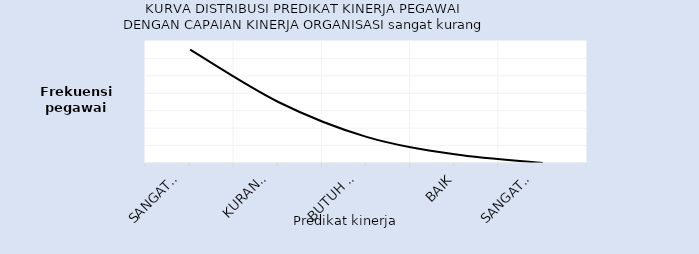
| Category | Series 0 |
|---|---|
| Sangat 
Kurang | 13 |
| Kurang/
Misconduct | 7 |
| Butuh 
Perbaikan | 3 |
| Baik | 1 |
| Sangat 
Baik | 0 |